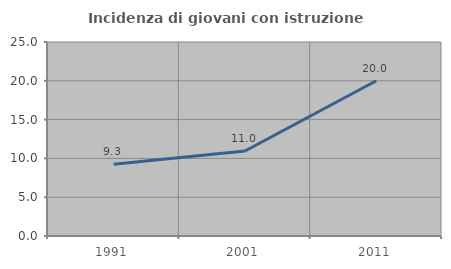
| Category | Incidenza di giovani con istruzione universitaria |
|---|---|
| 1991.0 | 9.259 |
| 2001.0 | 10.959 |
| 2011.0 | 20 |